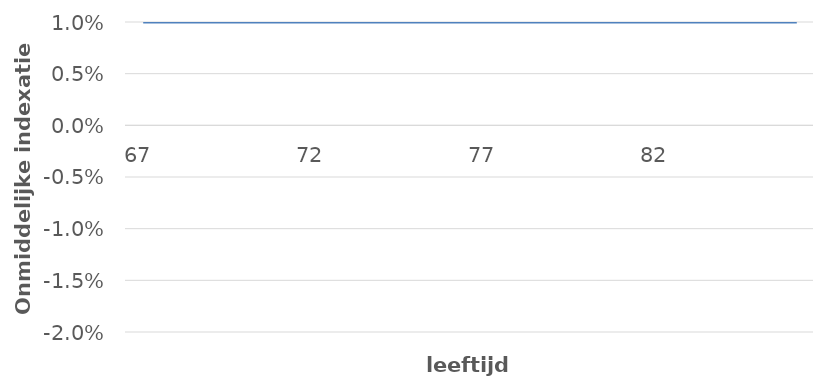
| Category | Series 0 |
|---|---|
| 67.0 | 0.01 |
| 68.0 | 0.01 |
| 69.0 | 0.01 |
| 70.0 | 0.01 |
| 71.0 | 0.01 |
| 72.0 | 0.01 |
| 73.0 | 0.01 |
| 74.0 | 0.01 |
| 75.0 | 0.01 |
| 76.0 | 0.01 |
| 77.0 | 0.01 |
| 78.0 | 0.01 |
| 79.0 | 0.01 |
| 80.0 | 0.01 |
| 81.0 | 0.01 |
| 82.0 | 0.01 |
| 83.0 | 0.01 |
| 84.0 | 0.01 |
| 85.0 | 0.01 |
| 86.0 | 0.01 |